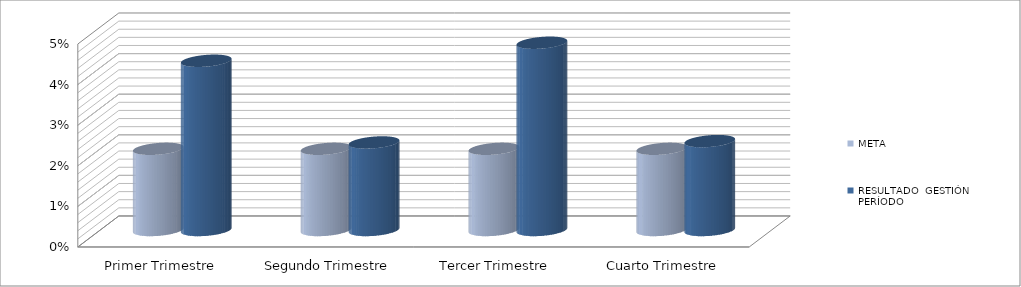
| Category | META | RESULTADO  GESTIÓN PERÍODO |
|---|---|---|
| Primer Trimestre | 0.02 | 0.042 |
| Segundo Trimestre | 0.02 | 0.022 |
| Tercer Trimestre | 0.02 | 0.046 |
| Cuarto Trimestre | 0.02 | 0.022 |